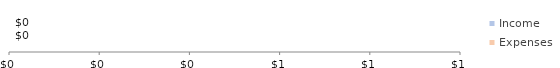
| Category | Expenses | Income |
|---|---|---|
| 0 | 0 | 0 |